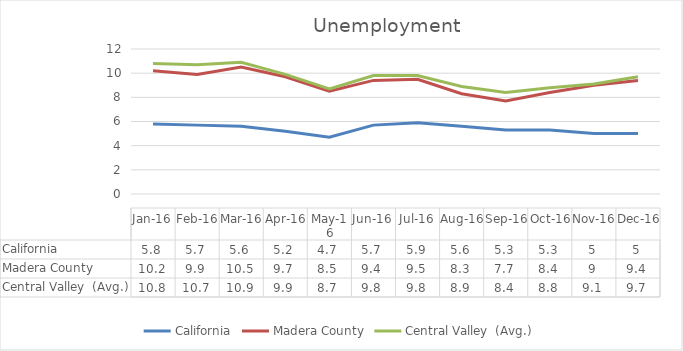
| Category | California | Madera County | Central Valley  (Avg.) |
|---|---|---|---|
| 2016-01-01 | 5.8 | 10.2 | 10.8 |
| 2016-02-01 | 5.7 | 9.9 | 10.7 |
| 2016-03-01 | 5.6 | 10.5 | 10.9 |
| 2016-04-01 | 5.2 | 9.7 | 9.9 |
| 2016-05-01 | 4.7 | 8.5 | 8.7 |
| 2016-06-01 | 5.7 | 9.4 | 9.8 |
| 2016-07-01 | 5.9 | 9.5 | 9.8 |
| 2016-08-01 | 5.6 | 8.3 | 8.9 |
| 2016-09-01 | 5.3 | 7.7 | 8.4 |
| 2016-10-01 | 5.3 | 8.4 | 8.8 |
| 2016-11-01 | 5 | 9 | 9.1 |
| 2016-12-01 | 5 | 9.4 | 9.7 |